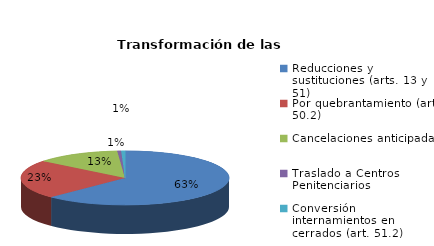
| Category | Series 0 |
|---|---|
| Reducciones y sustituciones (arts. 13 y 51) | 105 |
| Por quebrantamiento (art. 50.2) | 39 |
| Cancelaciones anticipadas | 22 |
| Traslado a Centros Penitenciarios | 1 |
| Conversión internamientos en cerrados (art. 51.2) | 1 |